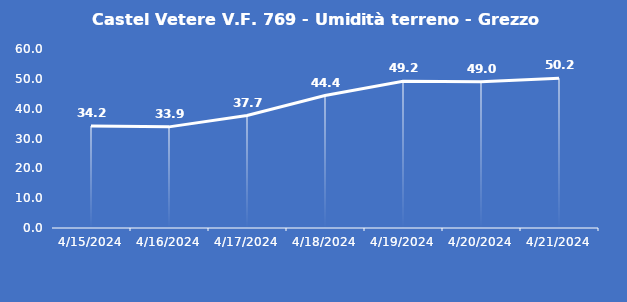
| Category | Castel Vetere V.F. 769 - Umidità terreno - Grezzo (%VWC) |
|---|---|
| 4/15/24 | 34.2 |
| 4/16/24 | 33.9 |
| 4/17/24 | 37.7 |
| 4/18/24 | 44.4 |
| 4/19/24 | 49.2 |
| 4/20/24 | 49 |
| 4/21/24 | 50.2 |